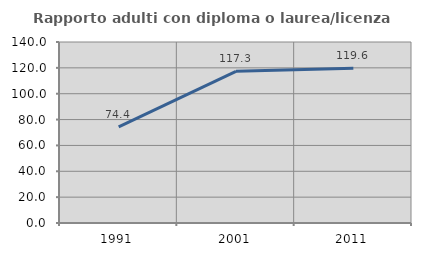
| Category | Rapporto adulti con diploma o laurea/licenza media  |
|---|---|
| 1991.0 | 74.408 |
| 2001.0 | 117.32 |
| 2011.0 | 119.643 |